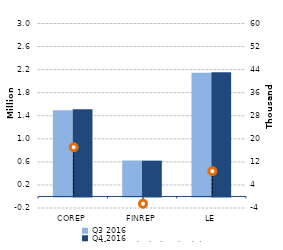
| Category | Q3 2016 | Q4 2016 |
|---|---|---|
| 0 | 1495609 | 1512683 |
| 1/1/00 | 624268 | 621754 |
| 1/2/00 | 2146112 | 2154895 |